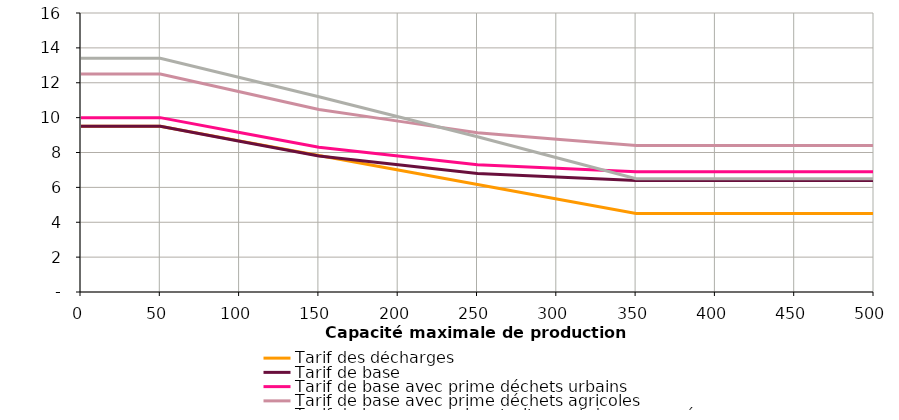
| Category | Tarif des décharges  | Tarif de base | Tarif de base avec prime déchets urbains | Tarif de base avec prime déchets agricoles | Tarif de base avec prime traitement des eaux usées |
|---|---|---|---|---|---|
| 0.0 | 9.5 | 9.5 | 10 | 12.5 | 13.4 |
| 50.0 | 9.5 | 9.5 | 10 | 12.5 | 13.4 |
| 100.0 | 8.667 | 8.65 | 9.15 | 11.483 | 12.3 |
| 150.0 | 7.833 | 7.8 | 8.3 | 10.467 | 11.2 |
| 200.0 | 7 | 7.3 | 7.8 | 9.8 | 10.05 |
| 250.0 | 6.167 | 6.8 | 7.3 | 9.133 | 8.9 |
| 300.0 | 5.333 | 6.6 | 7.1 | 8.767 | 7.7 |
| 350.0 | 4.5 | 6.4 | 6.9 | 8.4 | 6.5 |
| 400.0 | 4.5 | 6.4 | 6.9 | 8.4 | 6.5 |
| 450.0 | 4.5 | 6.4 | 6.9 | 8.4 | 6.5 |
| 500.0 | 4.5 | 6.4 | 6.9 | 8.4 | 6.5 |